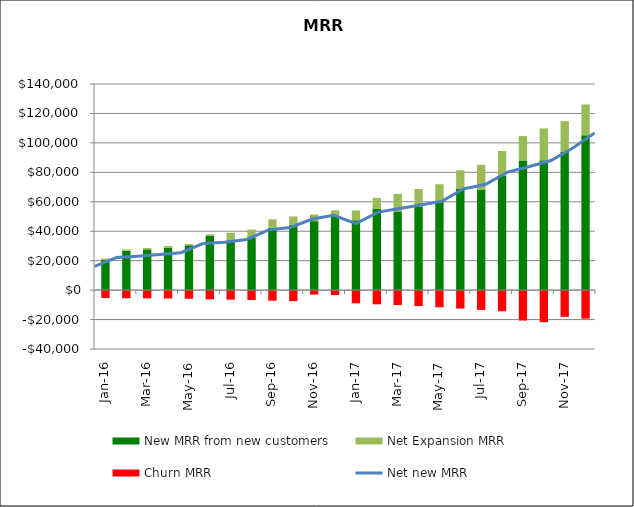
| Category | New MRR from new customers | Net Expansion MRR | Churn MRR |
|---|---|---|---|
| 0 | 20650 | 800 | -5400 |
| 1900-01-01 | 26733.5 | 884.25 | -5500 |
| 1900-01-02 | 27676.19 | 913.319 | -5603 |
| 1900-01-03 | 28932.661 | 946.721 | -5707.018 |
| 1900-01-04 | 30456.543 | 781.759 | -5862.814 |
| 1900-01-05 | 36892.915 | 1029.584 | -6275.188 |
| 1900-01-06 | 33343.389 | 5617.069 | -6486.614 |
| 1900-01-07 | 35429.388 | 5670.022 | -6700.123 |
| 1900-01-08 | 42379.808 | 5731.28 | -7174.612 |
| 1900-01-09 | 44401.641 | 5592.043 | -7445.662 |
| 1900-01-10 | 46863.715 | 4457.172 | -3033.141 |
| 1900-01-11 | 49666.843 | 4541.44 | -3363.648 |
| 1900-01-12 | 47444.371 | 6637.128 | -8961.484 |
| 1900-01-13 | 55409.107 | 7243.605 | -9671.382 |
| 1900-01-14 | 53456.419 | 11880.615 | -10121.534 |
| 1900-01-15 | 56856.75 | 11792 | -10844.15 |
| 1900-01-16 | 60236.093 | 11713.561 | -11681.633 |
| 1900-01-17 | 69029.279 | 12362.883 | -12527.345 |
| 1900-01-18 | 68296.963 | 16816.271 | -13435.77 |
| 1900-01-19 | 77716.162 | 16771.244 | -14353.092 |
| 1900-01-20 | 87675.549 | 16960.244 | -20664.166 |
| 1900-01-21 | 88127.38 | 21669.706 | -21767.138 |
| 1900-01-22 | 93855.482 | 20948.743 | -18158.478 |
| 1900-01-23 | 105143.985 | 20968.886 | -19396.041 |